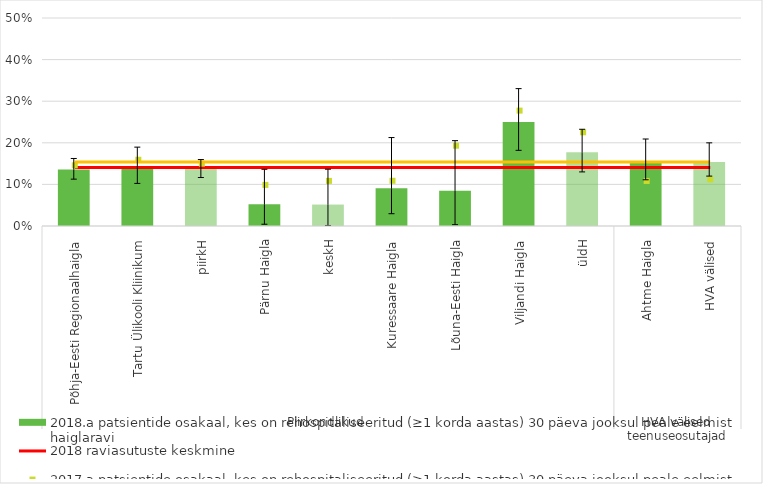
| Category | 2018.a patsientide osakaal, kes on rehospitaliseeritud (≥1 korda aastas) 30 päeva jooksul peale eelmist haiglaravi |
|---|---|
| 0 | 0.136 |
| 1 | 0.141 |
| 2 | 0.137 |
| 3 | 0.052 |
| 4 | 0.052 |
| 5 | 0.091 |
| 6 | 0.085 |
| 7 | 0.25 |
| 8 | 0.177 |
| 9 | 0.154 |
| 10 | 0.154 |